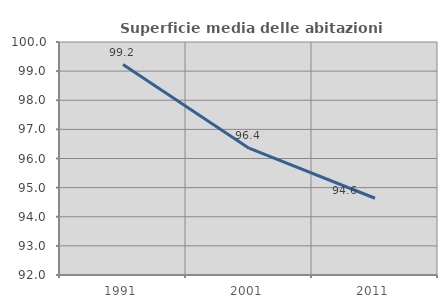
| Category | Superficie media delle abitazioni occupate |
|---|---|
| 1991.0 | 99.227 |
| 2001.0 | 96.354 |
| 2011.0 | 94.635 |